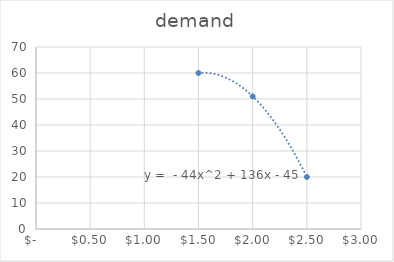
| Category | demand |
|---|---|
| 1.5 | 60 |
| 2.0 | 51 |
| 2.5 | 20 |